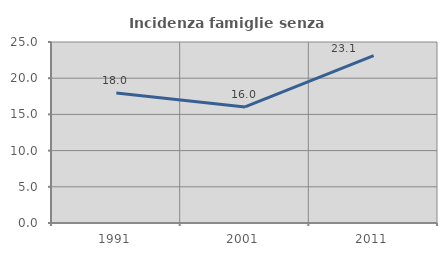
| Category | Incidenza famiglie senza nuclei |
|---|---|
| 1991.0 | 17.97 |
| 2001.0 | 16.028 |
| 2011.0 | 23.112 |